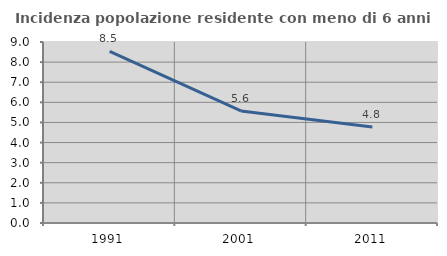
| Category | Incidenza popolazione residente con meno di 6 anni |
|---|---|
| 1991.0 | 8.535 |
| 2001.0 | 5.574 |
| 2011.0 | 4.774 |